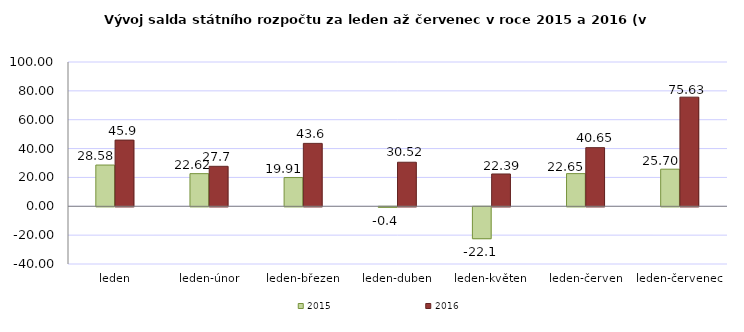
| Category | 2015 | 2016 |
|---|---|---|
| leden | 28.583 | 45.869 |
| leden-únor | 22.625 | 27.694 |
| leden-březen | 19.915 | 43.597 |
| leden-duben | -0.375 | 30.52 |
| leden-květen | -22.128 | 22.387 |
| leden-červen | 22.646 | 40.645 |
| leden-červenec | 25.704 | 75.628 |